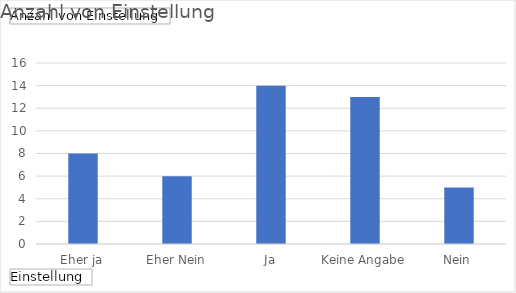
| Category | Ergebnis |
|---|---|
| Eher ja | 8 |
| Eher Nein | 6 |
| Ja | 14 |
| Keine Angabe | 13 |
| Nein | 5 |